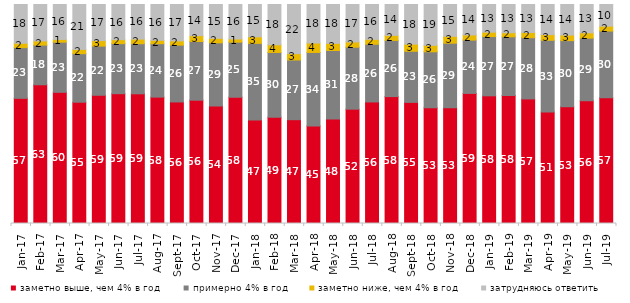
| Category | заметно выше, чем 4% в год | примерно 4% в год | заметно ниже, чем 4% в год | затрудняюсь ответить |
|---|---|---|---|---|
| 2017-01-01 | 57.15 | 23.15 | 2 | 17.7 |
| 2017-02-01 | 63.35 | 18.1 | 1.9 | 16.65 |
| 2017-03-01 | 59.9 | 22.9 | 1.25 | 15.95 |
| 2017-04-01 | 55.35 | 22.15 | 1.95 | 20.5 |
| 2017-05-01 | 58.55 | 22.45 | 2.5 | 16.5 |
| 2017-06-01 | 59.25 | 22.85 | 1.8 | 16.05 |
| 2017-07-01 | 59.2 | 22.85 | 2.1 | 15.8 |
| 2017-08-01 | 57.7 | 24.4 | 1.55 | 16.35 |
| 2017-09-01 | 55.5 | 25.95 | 1.95 | 16.6 |
| 2017-10-01 | 56.3 | 26.8 | 2.65 | 14.25 |
| 2017-11-01 | 53.6 | 28.9 | 2.05 | 15.45 |
| 2017-12-01 | 57.65 | 25.15 | 1.45 | 15.75 |
| 2018-01-01 | 47.25 | 35 | 3 | 14.75 |
| 2018-02-01 | 48.5 | 29.6 | 3.5 | 18.4 |
| 2018-03-01 | 47.4 | 27.25 | 2.9 | 22.45 |
| 2018-04-01 | 44.55 | 33.55 | 4.3 | 17.6 |
| 2018-05-01 | 47.7 | 31.3 | 3.25 | 17.75 |
| 2018-06-01 | 52.2 | 28.3 | 2.4 | 17.1 |
| 2018-07-01 | 55.5 | 26.35 | 2.25 | 15.9 |
| 2018-08-01 | 57.95 | 25.65 | 2.3 | 14.1 |
| 2018-09-01 | 55.3 | 23.35 | 3.25 | 18.1 |
| 2018-10-01 | 52.85 | 25.55 | 2.95 | 18.65 |
| 2018-11-01 | 52.844 | 29.491 | 3.144 | 14.521 |
| 2018-12-01 | 59.4 | 24.35 | 2.35 | 13.9 |
| 2019-01-01 | 58.3 | 27.05 | 2 | 12.65 |
| 2019-02-01 | 58.45 | 26.8 | 1.85 | 12.9 |
| 2019-03-01 | 56.887 | 27.946 | 2.387 | 12.78 |
| 2019-04-01 | 50.891 | 32.772 | 2.574 | 13.762 |
| 2019-05-01 | 53.343 | 30.163 | 2.526 | 13.967 |
| 2019-06-01 | 56.06 | 28.579 | 2.444 | 12.918 |
| 2019-07-01 | 57.475 | 30.396 | 2.228 | 9.901 |